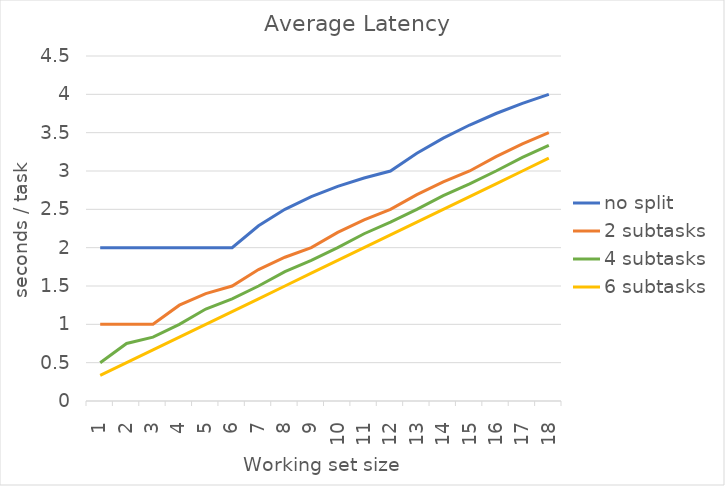
| Category | no split | 2 subtasks | 4 subtasks | 6 subtasks |
|---|---|---|---|---|
| 1.0 | 2 | 1 | 0.5 | 0.333 |
| 2.0 | 2 | 1 | 0.75 | 0.5 |
| 3.0 | 2 | 1 | 0.833 | 0.667 |
| 4.0 | 2 | 1.25 | 1 | 0.833 |
| 5.0 | 2 | 1.4 | 1.2 | 1 |
| 6.0 | 2 | 1.5 | 1.333 | 1.167 |
| 7.0 | 2.286 | 1.714 | 1.5 | 1.333 |
| 8.0 | 2.5 | 1.875 | 1.688 | 1.5 |
| 9.0 | 2.667 | 2 | 1.833 | 1.667 |
| 10.0 | 2.8 | 2.2 | 2 | 1.833 |
| 11.0 | 2.909 | 2.364 | 2.182 | 2 |
| 12.0 | 3 | 2.5 | 2.333 | 2.167 |
| 13.0 | 3.231 | 2.692 | 2.5 | 2.333 |
| 14.0 | 3.429 | 2.857 | 2.679 | 2.5 |
| 15.0 | 3.6 | 3 | 2.833 | 2.667 |
| 16.0 | 3.75 | 3.188 | 3 | 2.833 |
| 17.0 | 3.882 | 3.353 | 3.176 | 3 |
| 18.0 | 4 | 3.5 | 3.333 | 3.167 |